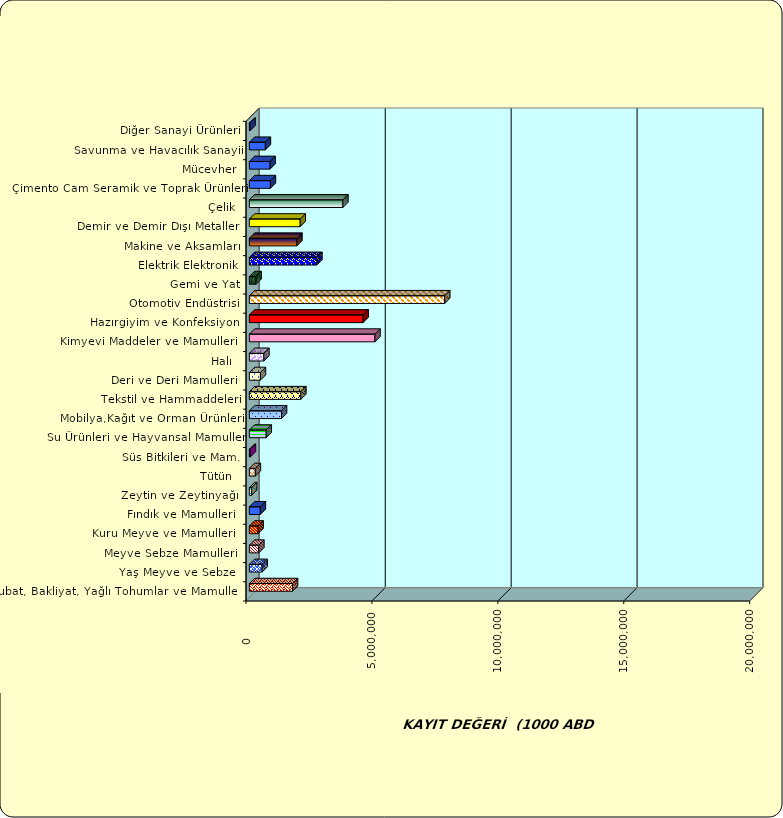
| Category | Series 0 |
|---|---|
|  Hububat, Bakliyat, Yağlı Tohumlar ve Mamulleri  | 1714489.416 |
|  Yaş Meyve ve Sebze   | 509516.561 |
|  Meyve Sebze Mamulleri  | 376157.635 |
|  Kuru Meyve ve Mamulleri   | 346269.804 |
|  Fındık ve Mamulleri  | 435386.013 |
|  Zeytin ve Zeytinyağı  | 90821.034 |
|  Tütün  | 238423.068 |
|  Süs Bitkileri ve Mam. | 41422.252 |
|  Su Ürünleri ve Hayvansal Mamuller | 670230.719 |
|  Mobilya,Kağıt ve Orman Ürünleri | 1277440.203 |
|  Tekstil ve Hammaddeleri | 2044156.477 |
|  Deri ve Deri Mamulleri  | 440150.746 |
|  Halı  | 577848.421 |
|  Kimyevi Maddeler ve Mamulleri   | 4988376.915 |
|  Hazırgiyim ve Konfeksiyon  | 4516511.959 |
|  Otomotiv Endüstrisi | 7758396.265 |
|  Gemi ve Yat | 267721.487 |
|  Elektrik Elektronik | 2681537.704 |
|  Makine ve Aksamları | 1888586.592 |
|  Demir ve Demir Dışı Metaller  | 2019241.487 |
|  Çelik | 3714171.372 |
|  Çimento Cam Seramik ve Toprak Ürünleri | 835957.373 |
|  Mücevher | 824097.731 |
|  Savunma ve Havacılık Sanayii | 635658.667 |
|  Diğer Sanayi Ürünleri | 27712.076 |